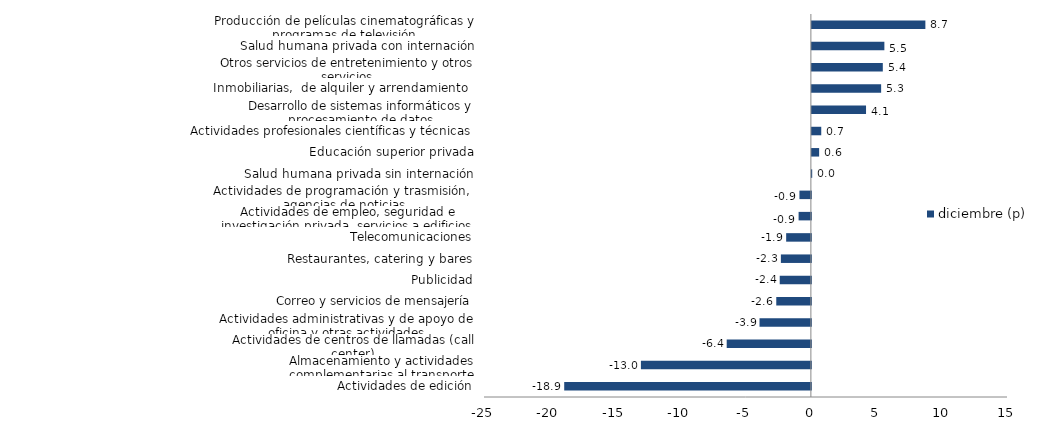
| Category | diciembre (p) |
|---|---|
| Actividades de edición | -18.865 |
| Almacenamiento y actividades complementarias al transporte | -13 |
| Actividades de centros de llamadas (call center) | -6.438 |
| Actividades administrativas y de apoyo de oficina y otras actividades | -3.928 |
| Correo y servicios de mensajería | -2.647 |
| Publicidad | -2.382 |
| Restaurantes, catering y bares | -2.295 |
| Telecomunicaciones | -1.89 |
| Actividades de empleo, seguridad e investigación privada, servicios a edificios | -0.939 |
| Actividades de programación y trasmisión,  agencias de noticias | -0.875 |
| Salud humana privada sin internación | 0.025 |
| Educación superior privada | 0.555 |
| Actividades profesionales científicas y técnicas  | 0.717 |
| Desarrollo de sistemas informáticos y procesamiento de datos | 4.143 |
| Inmobiliarias,  de alquiler y arrendamiento  | 5.297 |
| Otros servicios de entretenimiento y otros servicios | 5.425 |
| Salud humana privada con internación | 5.545 |
| Producción de películas cinematográficas y programas de televisión | 8.681 |